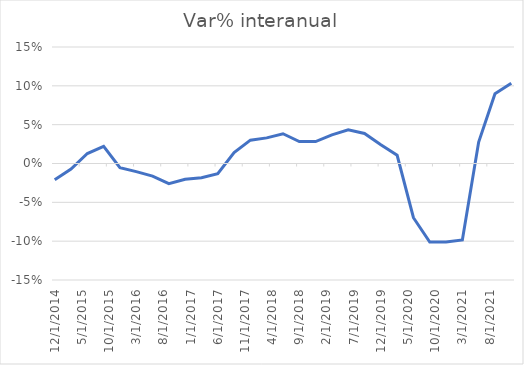
| Category | Series 0 |
|---|---|
| 12/20/14 | -0.021 |
| 3/20/15 | -0.007 |
| 6/18/15 | 0.013 |
| 9/16/15 | 0.022 |
| 12/15/15 | -0.005 |
| 3/14/16 | -0.01 |
| 6/12/16 | -0.016 |
| 9/10/16 | -0.026 |
| 12/9/16 | -0.02 |
| 3/9/17 | -0.018 |
| 6/7/17 | -0.013 |
| 9/5/17 | 0.014 |
| 12/4/17 | 0.03 |
| 3/30/18 | 0.033 |
| 6/28/18 | 0.038 |
| 9/26/18 | 0.028 |
| 12/25/18 | 0.028 |
| 3/25/19 | 0.037 |
| 6/23/19 | 0.043 |
| 9/21/19 | 0.039 |
| 12/20/19 | 0.024 |
| 3/19/20 | 0.011 |
| 6/17/20 | -0.07 |
| 9/15/20 | -0.101 |
| 12/14/20 | -0.101 |
| 3/14/21 | -0.099 |
| 6/12/21 | 0.028 |
| 9/10/21 | 0.09 |
| 12/9/21 | 0.103 |